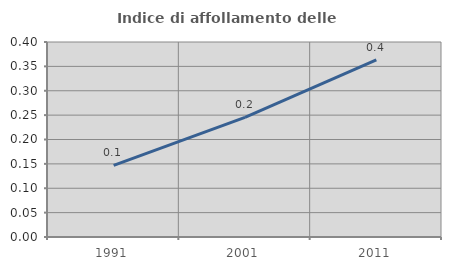
| Category | Indice di affollamento delle abitazioni  |
|---|---|
| 1991.0 | 0.147 |
| 2001.0 | 0.245 |
| 2011.0 | 0.363 |